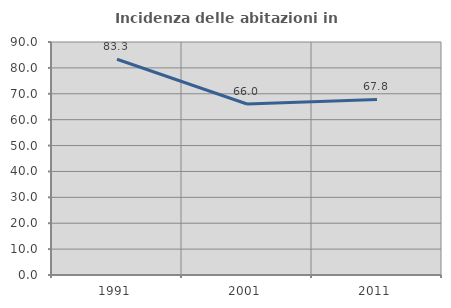
| Category | Incidenza delle abitazioni in proprietà  |
|---|---|
| 1991.0 | 83.333 |
| 2001.0 | 66.038 |
| 2011.0 | 67.797 |